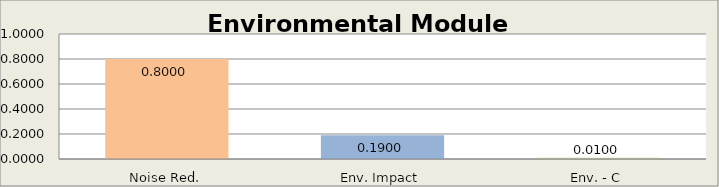
| Category | Environmental Module |
|---|---|
| Noise Red. | 0.8 |
| Env. Impact | 0.19 |
| Env. - C | 0.01 |